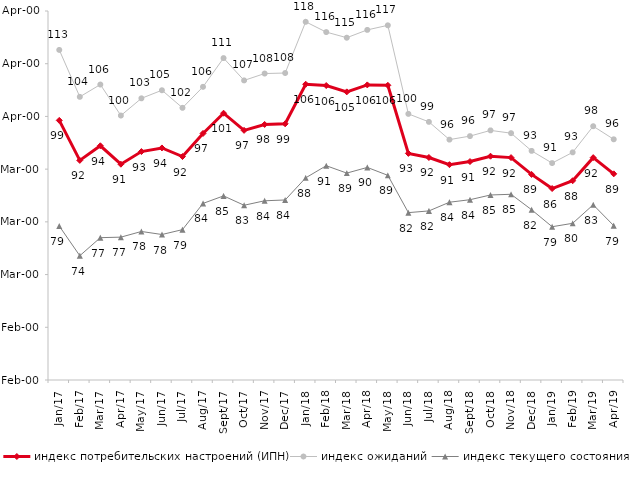
| Category | индекс потребительских настроений (ИПН) | Series 0 | индекс ожиданий | Series 3 | индекс текущего состояния |
|---|---|---|---|---|---|
| 2017-01-01 | 99.25 | 2017-01-01 | 112.617 | 2017-01-01 | 79.2 |
| 2017-02-01 | 91.66 | 2017-02-01 | 103.717 | 2017-02-01 | 73.575 |
| 2017-03-01 | 94.43 | 2017-03-01 | 106.05 | 2017-03-01 | 77 |
| 2017-04-01 | 90.94 | 2017-04-01 | 100.167 | 2017-04-01 | 77.1 |
| 2017-05-01 | 93.33 | 2017-05-01 | 103.433 | 2017-05-01 | 78.175 |
| 2017-06-01 | 94.02 | 2017-06-01 | 104.967 | 2017-06-01 | 77.6 |
| 2017-07-01 | 92.39 | 2017-07-01 | 101.633 | 2017-07-01 | 78.525 |
| 2017-08-01 | 96.77 | 2017-08-01 | 105.617 | 2017-08-01 | 83.5 |
| 2017-09-01 | 100.61 | 2017-09-01 | 111.067 | 2017-09-01 | 84.925 |
| 2017-10-01 | 97.36 | 2017-10-01 | 106.833 | 2017-10-01 | 83.15 |
| 2017-11-01 | 98.48 | 2017-11-01 | 108.133 | 2017-11-01 | 84 |
| 2017-12-01 | 98.6 | 2017-12-01 | 108.233 | 2017-12-01 | 84.15 |
| 2018-01-01 | 106.11 | 2018-01-01 | 117.95 | 2018-01-01 | 88.35 |
| 2018-02-01 | 105.86 | 2018-02-01 | 116 | 2018-02-01 | 90.65 |
| 2018-03-01 | 104.66 | 2018-03-01 | 114.933 | 2018-03-01 | 89.25 |
| 2018-04-01 | 105.98 | 2018-04-01 | 116.417 | 2018-04-01 | 90.325 |
| 2018-05-01 | 105.9 | 2018-05-01 | 117.283 | 2018-05-01 | 88.825 |
| 2018-06-01 | 92.99 | 2018-06-01 | 100.483 | 2018-06-01 | 81.75 |
| 2018-07-01 | 92.21 | 2018-07-01 | 98.967 | 2018-07-01 | 82.075 |
| 2018-08-01 | 90.85 | 2018-08-01 | 95.6 | 2018-08-01 | 83.725 |
| 2018-09-01 | 91.44 | 2018-09-01 | 96.267 | 2018-09-01 | 84.2 |
| 2018-10-01 | 92.45 | 2018-10-01 | 97.35 | 2018-10-01 | 85.1 |
| 2018-11-01 | 92.186 | 2018-11-01 | 96.823 | 2018-11-01 | 85.23 |
| 2018-12-01 | 89 | 2018-12-01 | 93.467 | 2018-12-01 | 82.3 |
| 2019-01-01 | 86.32 | 2019-01-01 | 91.15 | 2019-01-01 | 79.075 |
| 2019-02-01 | 87.8 | 2019-02-01 | 93.183 | 2019-02-01 | 79.725 |
| 2019-03-01 | 92.183 | 2019-03-01 | 98.144 | 2019-03-01 | 83.242 |
| 2019-04-01 | 89.109 | 2019-04-01 | 95.66 | 2019-04-01 | 79.282 |